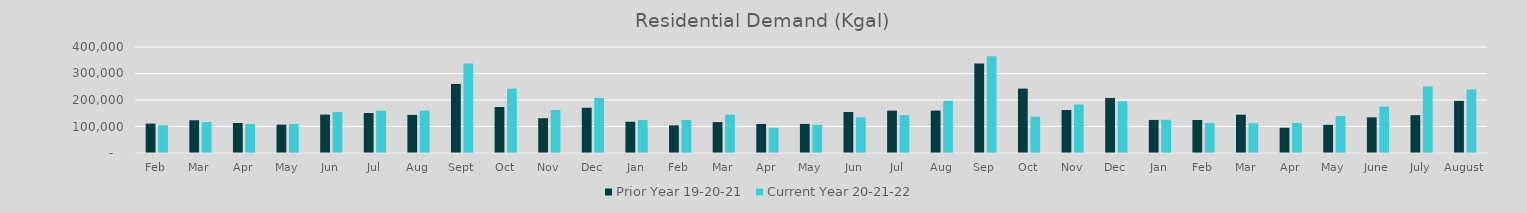
| Category | Prior Year 19-20-21 | Current Year 20-21-22 |
|---|---|---|
| Feb | 111009.962 | 104204.224 |
| Mar | 123525.131 | 116687.491 |
| Apr | 113258.787 | 109598.965 |
| May | 107128.051 | 109656.015 |
| Jun | 144930.453 | 154696.236 |
| Jul | 151028.014 | 159889.353 |
| Aug | 143816.337 | 160013.985 |
| Sep | 260607.456 | 337995.641 |
| Oct | 173601.368 | 243049.084 |
| Nov | 131198.833 | 162175.563 |
| Dec | 170629.384 | 207737.904 |
| Jan | 117899.625 | 124779.797 |
| Feb | 104204.224 | 124538.238 |
| Mar | 116687.491 | 144510.137 |
| Apr | 109598.965 | 95313.825 |
| May | 109656.015 | 106271.913 |
| Jun | 154696.236 | 134556.172 |
| Jul | 159889.353 | 142779.003 |
| Aug | 160013.985 | 196888.231 |
| Sep | 337995.641 | 364911.478 |
| Oct | 243049.084 | 137121.969 |
| Nov | 162175.563 | 182996.966 |
| Dec | 207737.904 | 195285.925 |
| Jan | 124779.797 | 125449.092 |
| Feb | 124538.238 | 113415.44 |
| Mar | 144510.137 | 112550.393 |
| Apr | 95313.825 | 113675.535 |
| May | 106271.913 | 139571.108 |
| June | 134556.172 | 175001.205 |
| July | 142779.003 | 251418.545 |
| August | 196888.231 | 239882.104 |